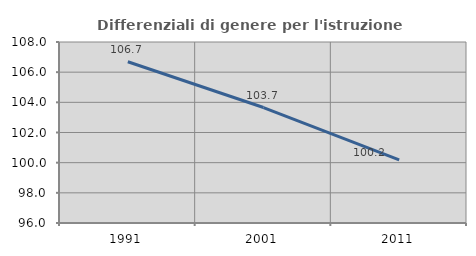
| Category | Differenziali di genere per l'istruzione superiore |
|---|---|
| 1991.0 | 106.692 |
| 2001.0 | 103.656 |
| 2011.0 | 100.188 |